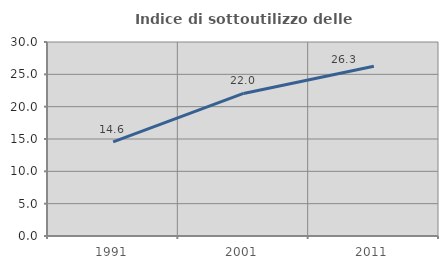
| Category | Indice di sottoutilizzo delle abitazioni  |
|---|---|
| 1991.0 | 14.558 |
| 2001.0 | 22.047 |
| 2011.0 | 26.257 |